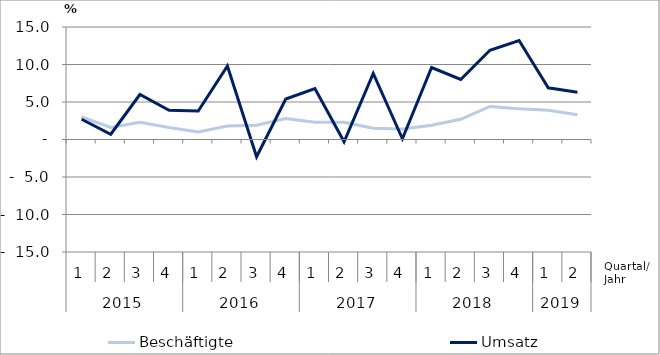
| Category | Beschäftigte | Umsatz |
|---|---|---|
| 0 | 3 | 2.7 |
| 1 | 1.6 | 0.7 |
| 2 | 2.3 | 6 |
| 3 | 1.6 | 3.9 |
| 4 | 1 | 3.8 |
| 5 | 1.8 | 9.8 |
| 6 | 1.9 | -2.3 |
| 7 | 2.8 | 5.4 |
| 8 | 2.3 | 6.8 |
| 9 | 2.3 | -0.3 |
| 10 | 1.5 | 8.8 |
| 11 | 1.4 | 0.1 |
| 12 | 1.9 | 9.6 |
| 13 | 2.7 | 8 |
| 14 | 4.4 | 11.9 |
| 15 | 4.1 | 13.2 |
| 16 | 3.9 | 6.9 |
| 17 | 3.3 | 6.3 |